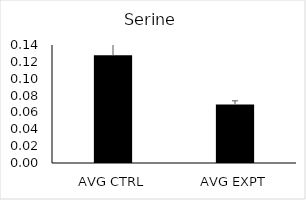
| Category | Series 0 |
|---|---|
| AVG CTRL | 0.128 |
| AVG EXPT | 0.069 |